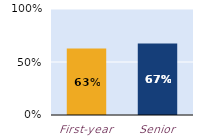
| Category | substantially |
|---|---|
| First-year | 0.627 |
| Senior | 0.675 |